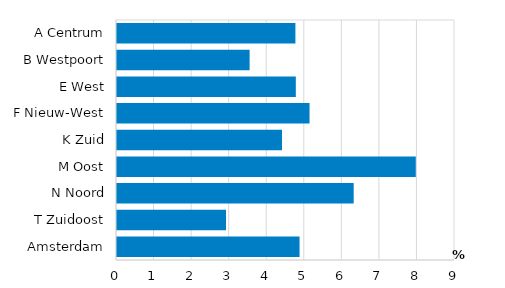
| Category | Series 3 |
|---|---|
| A Centrum | 4.75 |
| B Westpoort | 3.531 |
| E West | 4.762 |
| F Nieuw-West | 5.127 |
| K Zuid | 4.394 |
| M Oost | 7.956 |
| N Noord | 6.302 |
| T Zuidoost | 2.903 |
| Amsterdam | 4.861 |